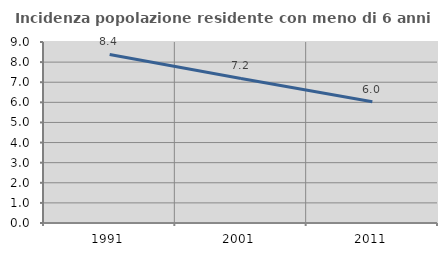
| Category | Incidenza popolazione residente con meno di 6 anni |
|---|---|
| 1991.0 | 8.382 |
| 2001.0 | 7.19 |
| 2011.0 | 6.032 |